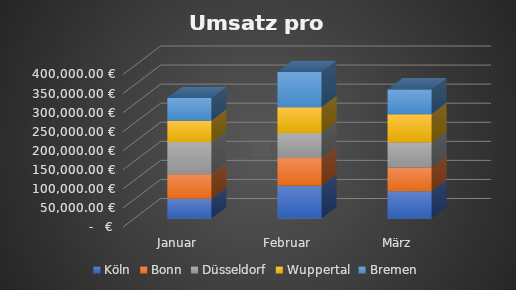
| Category | Köln | Bonn | Düsseldorf | Wuppertal | Bremen |
|---|---|---|---|---|---|
| Januar | 51459 | 64457 | 84853 | 55507 | 59421 |
| Februar | 85757 | 72656 | 66034 | 67369 | 92353 |
| März | 71605 | 61473 | 66350 | 73939 | 65021 |